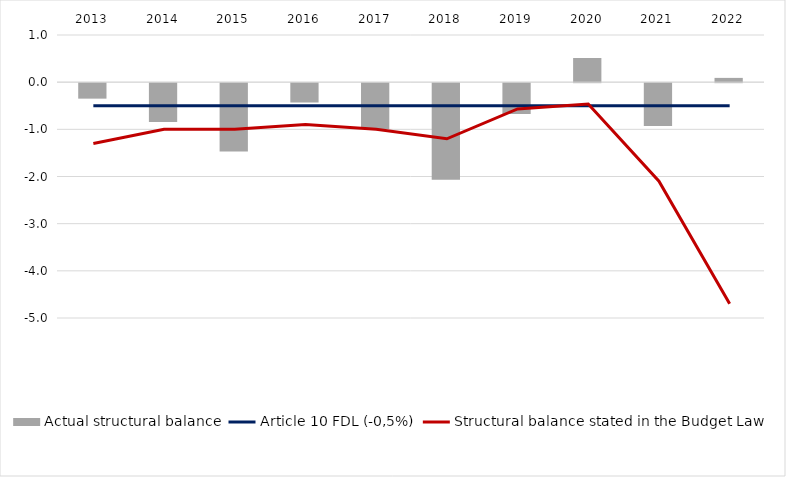
| Category | Actual structural balance |
|---|---|
| 2013.0 | -0.328 |
| 2014.0 | -0.824 |
| 2015.0 | -1.447 |
| 2016.0 | -0.41 |
| 2017.0 | -0.971 |
| 2018.0 | -2.048 |
| 2019.0 | -0.655 |
| 2020.0 | 0.512 |
| 2021.0 | -0.909 |
| 2022.0 | 0.091 |